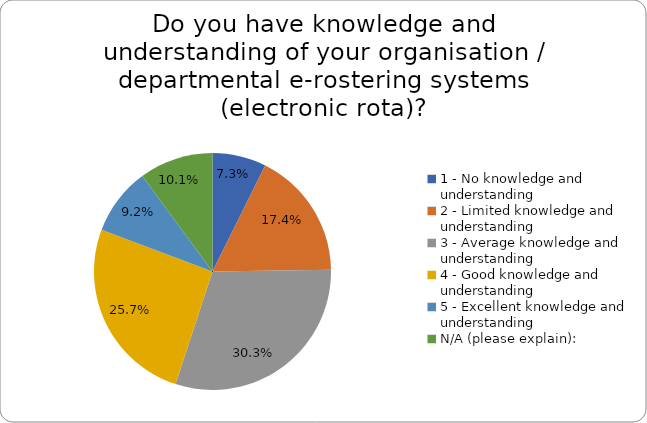
| Category | Series 0 |
|---|---|
| 1 - No knowledge and understanding | 0.073 |
| 2 - Limited knowledge and understanding | 0.174 |
| 3 - Average knowledge and understanding | 0.303 |
| 4 - Good knowledge and understanding | 0.257 |
| 5 - Excellent knowledge and understanding | 0.092 |
| N/A (please explain): | 0.101 |